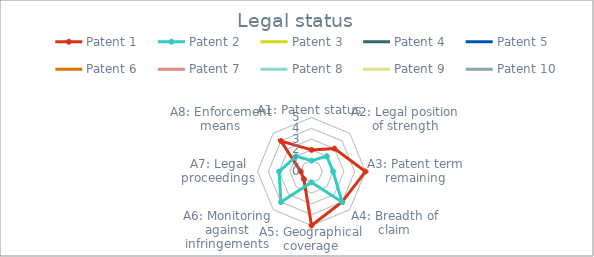
| Category | Patent 1 | Patent 2 | Patent 3 | Patent 4 | Patent 5 | Patent 6 | Patent 7 | Patent 8 | Patent 9 | Patent 10 |
|---|---|---|---|---|---|---|---|---|---|---|
| A1: Patent status | 2 | 1 | 0 | 0 | 0 | 0 | 0 | 0 | 0 | 0 |
| A2: Legal position of strength | 3 | 2 | 0 | 0 | 0 | 0 | 0 | 0 | 0 | 0 |
| A3: Patent term remaining | 5 | 2 | 0 | 0 | 0 | 0 | 0 | 0 | 0 | 0 |
| A4: Breadth of claim | 4 | 4 | 0 | 0 | 0 | 0 | 0 | 0 | 0 | 0 |
| A5: Geographical coverage | 5 | 1 | 0 | 0 | 0 | 0 | 0 | 0 | 0 | 0 |
| A6: Monitoring against infringements | 1 | 4 | 0 | 0 | 0 | 0 | 0 | 0 | 0 | 0 |
| A7: Legal proceedings | 1 | 3 | 0 | 0 | 0 | 0 | 0 | 0 | 0 | 0 |
| A8: Enforcement means | 4 | 2 | 0 | 0 | 0 | 0 | 0 | 0 | 0 | 0 |